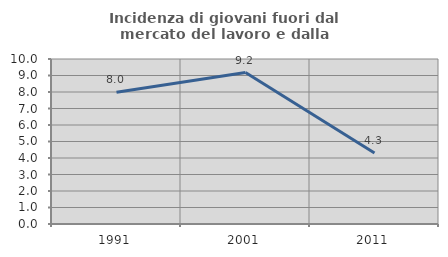
| Category | Incidenza di giovani fuori dal mercato del lavoro e dalla formazione  |
|---|---|
| 1991.0 | 7.981 |
| 2001.0 | 9.177 |
| 2011.0 | 4.305 |